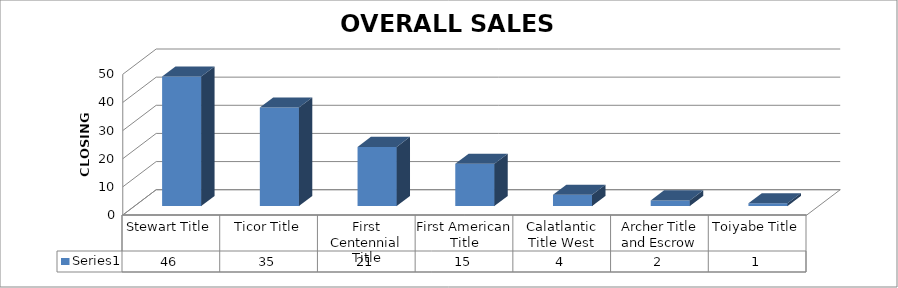
| Category | Series 0 |
|---|---|
| Stewart Title | 46 |
| Ticor Title | 35 |
| First Centennial Title | 21 |
| First American Title | 15 |
| Calatlantic Title West | 4 |
| Archer Title and Escrow | 2 |
| Toiyabe Title | 1 |